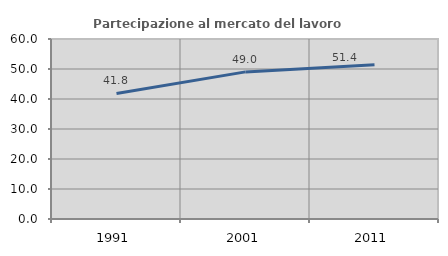
| Category | Partecipazione al mercato del lavoro  femminile |
|---|---|
| 1991.0 | 41.834 |
| 2001.0 | 49.04 |
| 2011.0 | 51.414 |